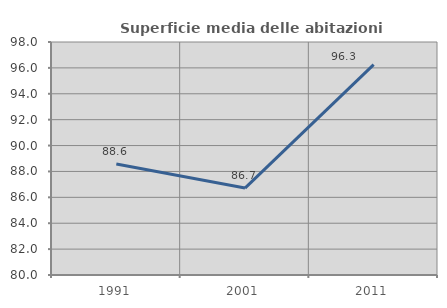
| Category | Superficie media delle abitazioni occupate |
|---|---|
| 1991.0 | 88.573 |
| 2001.0 | 86.716 |
| 2011.0 | 96.254 |